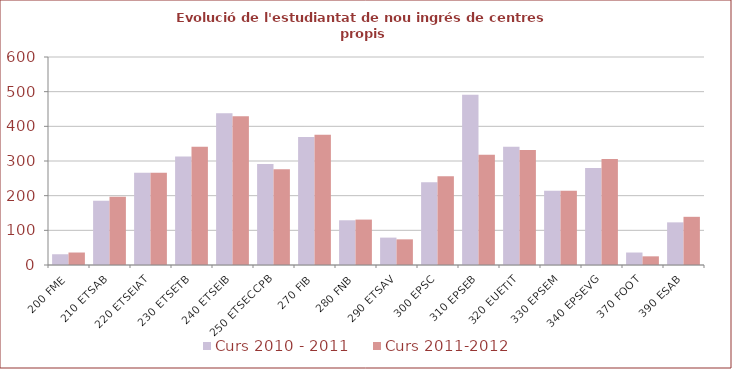
| Category | Curs 2010 - 2011 | Curs 2011-2012 |
|---|---|---|
| 200 FME | 31 | 36 |
| 210 ETSAB | 185 | 197 |
| 220 ETSEIAT | 266 | 266 |
| 230 ETSETB | 313 | 341 |
| 240 ETSEIB | 438 | 429 |
| 250 ETSECCPB | 291 | 276 |
| 270 FIB | 369 | 376 |
| 280 FNB | 129 | 131 |
| 290 ETSAV | 79 | 74 |
| 300 EPSC | 239 | 256 |
| 310 EPSEB | 491 | 318 |
| 320 EUETIT | 341 | 332 |
| 330 EPSEM | 214 | 214 |
| 340 EPSEVG | 280 | 306 |
| 370 FOOT | 36 | 25 |
| 390 ESAB | 123 | 139 |